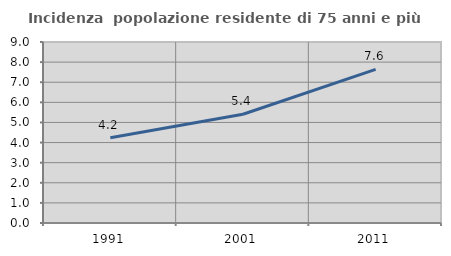
| Category | Incidenza  popolazione residente di 75 anni e più |
|---|---|
| 1991.0 | 4.242 |
| 2001.0 | 5.406 |
| 2011.0 | 7.642 |